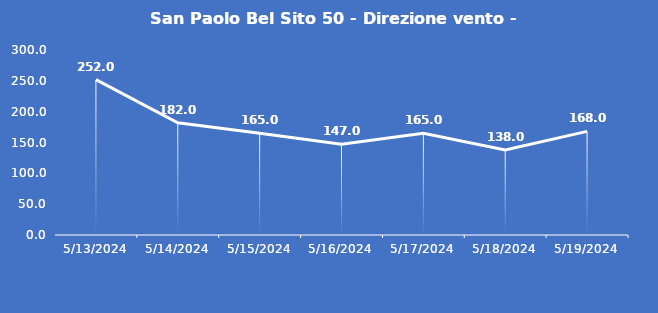
| Category | San Paolo Bel Sito 50 - Direzione vento - Grezzo (°N) |
|---|---|
| 5/13/24 | 252 |
| 5/14/24 | 182 |
| 5/15/24 | 165 |
| 5/16/24 | 147 |
| 5/17/24 | 165 |
| 5/18/24 | 138 |
| 5/19/24 | 168 |